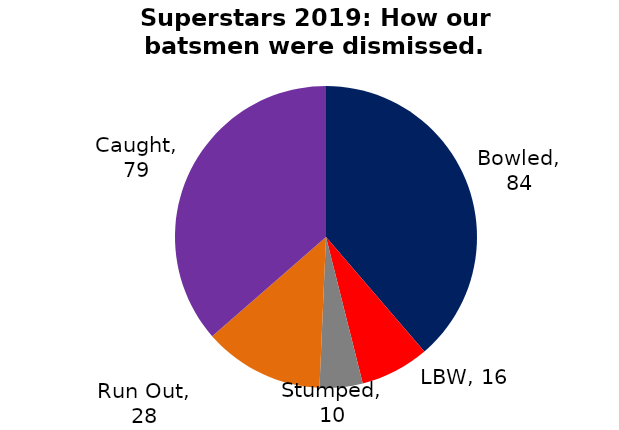
| Category | BATTING |
|---|---|
| Bowled | 84 |
| LBW | 16 |
| Stumped | 10 |
| Run Out | 28 |
| Caught | 79 |